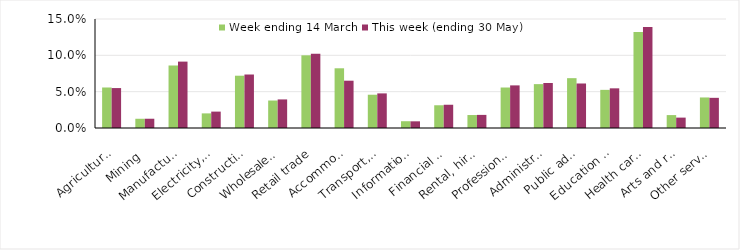
| Category | Week ending 14 March | This week (ending 30 May) |
|---|---|---|
| Agriculture, forestry and fishing | 0.056 | 0.055 |
| Mining | 0.013 | 0.013 |
| Manufacturing | 0.086 | 0.091 |
| Electricity, gas, water and waste services | 0.02 | 0.023 |
| Construction | 0.072 | 0.074 |
| Wholesale trade | 0.038 | 0.039 |
| Retail trade | 0.1 | 0.102 |
| Accommodation and food services | 0.082 | 0.065 |
| Transport, postal and warehousing | 0.046 | 0.048 |
| Information media and telecommunications | 0.009 | 0.009 |
| Financial and insurance services | 0.031 | 0.032 |
| Rental, hiring and real estate services | 0.018 | 0.018 |
| Professional, scientific and technical services | 0.056 | 0.059 |
| Administrative and support services | 0.06 | 0.062 |
| Public administration and safety | 0.069 | 0.061 |
| Education and training | 0.052 | 0.055 |
| Health care and social assistance | 0.132 | 0.139 |
| Arts and recreation services | 0.018 | 0.014 |
| Other services | 0.042 | 0.042 |